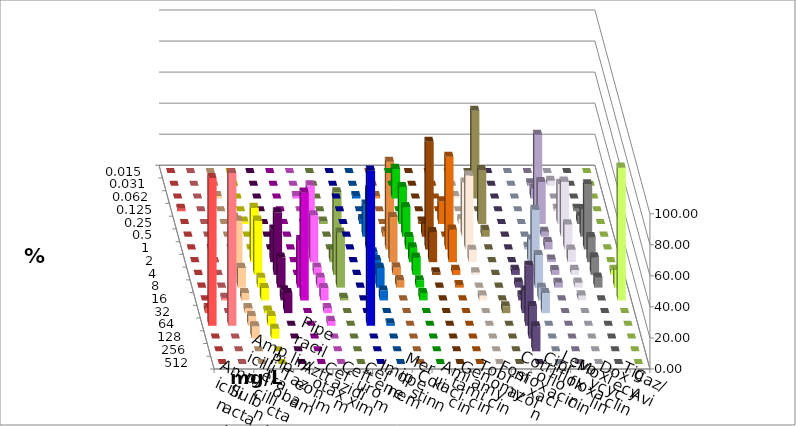
| Category | Ampicillin | Ampicillin/ Sulbactam | Piperacillin | Piperacillin/ Tazobactam | Aztreonam | Cefotaxim | Ceftazidim | Cefuroxim | Imipenem | Meropenem | Colistin | Amikacin | Gentamicin | Tobramycin | Fosfomycin | Cotrimoxazol | Ciprofloxacin | Levofloxacin | Moxifloxacin | Doxycyclin | Tigecyclin | Caz/Avi |
|---|---|---|---|---|---|---|---|---|---|---|---|---|---|---|---|---|---|---|---|---|---|---|
| 0.015 | 0 | 0 | 0 | 0 | 0 | 0 | 0 | 0 | 0 | 0 | 0 | 0 | 0 | 0 | 0 | 0 | 0 | 0 | 0 | 0 | 0 | 0 |
| 0.031 | 0 | 0 | 0 | 0 | 0 | 0 | 0 | 0 | 0 | 0 | 0 | 0 | 0 | 0 | 0 | 0 | 1.587 | 3.226 | 0 | 0 | 0 | 0 |
| 0.062 | 0 | 0 | 1.587 | 0 | 0 | 0 | 1.587 | 0 | 1.587 | 19.048 | 0 | 0 | 1.587 | 56.522 | 0 | 0 | 6.349 | 0 | 0 | 0 | 0 | 1.613 |
| 0.125 | 1.613 | 0 | 0 | 0 | 0 | 0 | 0 | 0 | 0 | 0 | 0 | 0 | 0 | 0 | 0 | 0 | 49.206 | 1.613 | 1.613 | 0 | 0 | 0 |
| 0.25 | 0 | 0 | 0 | 1.587 | 0 | 0 | 0 | 0 | 3.175 | 23.81 | 1.613 | 14.516 | 3.175 | 34.783 | 0 | 0 | 26.984 | 25.806 | 4.839 | 0 | 1.613 | 0 |
| 0.5 | 0 | 0 | 0 | 0 | 0 | 0 | 1.587 | 0 | 20.635 | 19.048 | 8.065 | 0 | 34.921 | 4.348 | 0 | 0 | 3.175 | 35.484 | 17.742 | 0 | 0 | 3.226 |
| 1.0 | 0 | 0 | 0 | 0 | 0 | 0 | 41.27 | 0 | 38.095 | 7.937 | 69.355 | 59.677 | 47.619 | 0 | 0 | 1.613 | 4.762 | 16.129 | 41.935 | 0 | 0 | 56.452 |
| 2.0 | 0 | 0 | 28.571 | 34.921 | 20.968 | 0 | 30.159 | 0 | 6.349 | 9.524 | 19.355 | 20.968 | 7.937 | 0 | 0 | 14.516 | 1.587 | 8.065 | 16.129 | 0 | 8.065 | 29.032 |
| 4.0 | 0 | 0 | 34.921 | 34.921 | 40.323 | 0 | 4.762 | 0 | 9.524 | 11.111 | 1.613 | 3.226 | 1.587 | 0 | 3.226 | 41.935 | 3.175 | 3.226 | 11.29 | 3.226 | 53.226 | 4.839 |
| 8.0 | 0 | 0 | 12.698 | 6.349 | 19.355 | 30.645 | 6.349 | 0 | 12.698 | 4.762 | 0 | 1.613 | 0 | 0 | 3.226 | 20.968 | 3.175 | 3.226 | 6.452 | 11.29 | 35.484 | 4.839 |
| 16.0 | 0 | 1.613 | 4.762 | 7.937 | 6.452 | 69.355 | 7.937 | 0 | 6.349 | 4.762 | 0 | 0 | 3.175 | 0 | 3.226 | 8.065 | 0 | 3.226 | 0 | 85.484 | 1.613 | 0 |
| 32.0 | 3.226 | 0 | 3.175 | 1.587 | 12.903 | 0 | 3.175 | 0 | 0 | 0 | 0 | 0 | 0 | 4.348 | 14.516 | 12.903 | 0 | 0 | 0 | 0 | 0 | 0 |
| 64.0 | 95.161 | 98.387 | 6.349 | 6.349 | 0 | 0 | 3.175 | 100 | 1.587 | 0 | 0 | 0 | 0 | 0 | 38.71 | 0 | 0 | 0 | 0 | 0 | 0 | 0 |
| 128.0 | 0 | 0 | 7.937 | 6.349 | 0 | 0 | 0 | 0 | 0 | 0 | 0 | 0 | 0 | 0 | 20.968 | 0 | 0 | 0 | 0 | 0 | 0 | 0 |
| 256.0 | 0 | 0 | 0 | 0 | 0 | 0 | 0 | 0 | 0 | 0 | 0 | 0 | 0 | 0 | 16.129 | 0 | 0 | 0 | 0 | 0 | 0 | 0 |
| 512.0 | 0 | 0 | 0 | 0 | 0 | 0 | 0 | 0 | 0 | 0 | 0 | 0 | 0 | 0 | 0 | 0 | 0 | 0 | 0 | 0 | 0 | 0 |